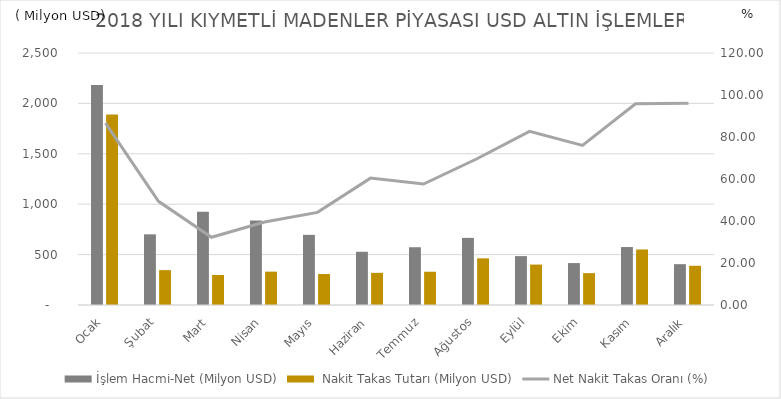
| Category | İşlem Hacmi-Net (Milyon USD) |  Nakit Takas Tutarı (Milyon USD) |
|---|---|---|
| Ocak | 2183 | 1890 |
| Şubat | 701 | 346 |
| Mart | 924 | 298 |
| Nisan | 838 | 331 |
| Mayıs | 696 | 307 |
| Haziran | 528 | 319 |
| Temmuz | 573 | 330 |
| Ağustos | 666 | 463 |
| Eylül | 485 | 401 |
| Ekim | 416 | 316 |
| Kasım | 575 | 551 |
| Aralık | 405 | 389 |